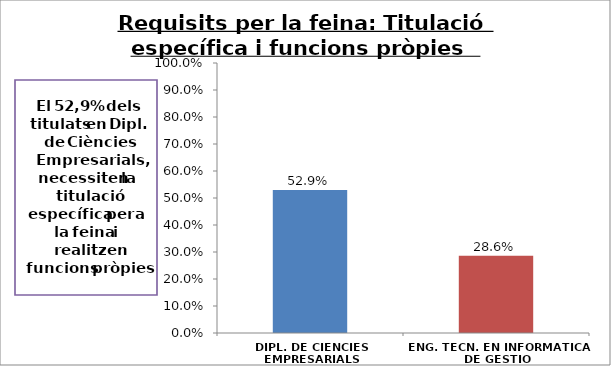
| Category | Series 0 |
|---|---|
| DIPL. DE CIENCIES EMPRESARIALS | 0.529 |
| ENG. TECN. EN INFORMATICA DE GESTIO | 0.286 |